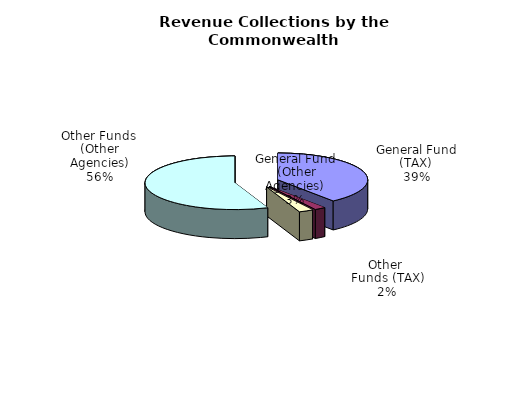
| Category | Series 0 |
|---|---|
| General Fund | 15755556000 |
| All Other Funds | 802626000 |
| General Fund | 1036412000 |
| All Other Funds | 22359349000 |